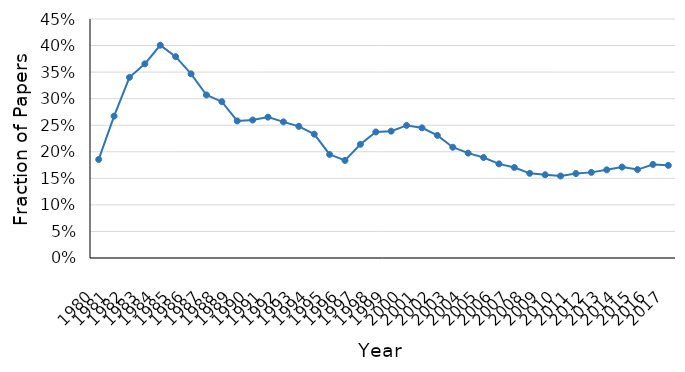
| Category | General Equilibrium |
|---|---|
| 1980.0 | 0.186 |
| 1981.0 | 0.267 |
| 1982.0 | 0.34 |
| 1983.0 | 0.366 |
| 1984.0 | 0.401 |
| 1985.0 | 0.379 |
| 1986.0 | 0.347 |
| 1987.0 | 0.307 |
| 1988.0 | 0.294 |
| 1989.0 | 0.258 |
| 1990.0 | 0.26 |
| 1991.0 | 0.265 |
| 1992.0 | 0.256 |
| 1993.0 | 0.248 |
| 1994.0 | 0.233 |
| 1995.0 | 0.195 |
| 1996.0 | 0.184 |
| 1997.0 | 0.214 |
| 1998.0 | 0.237 |
| 1999.0 | 0.239 |
| 2000.0 | 0.25 |
| 2001.0 | 0.245 |
| 2002.0 | 0.231 |
| 2003.0 | 0.209 |
| 2004.0 | 0.197 |
| 2005.0 | 0.189 |
| 2006.0 | 0.177 |
| 2007.0 | 0.17 |
| 2008.0 | 0.159 |
| 2009.0 | 0.157 |
| 2010.0 | 0.154 |
| 2011.0 | 0.159 |
| 2012.0 | 0.161 |
| 2013.0 | 0.166 |
| 2014.0 | 0.171 |
| 2015.0 | 0.166 |
| 2016.0 | 0.176 |
| 2017.0 | 0.174 |